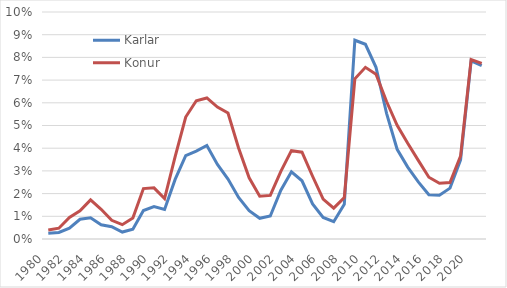
| Category | Karlar | Konur |
|---|---|---|
| 1980.0 | 0.257 | 0.394 |
| 1981.0 | 0.291 | 0.475 |
| 1982.0 | 0.478 | 0.952 |
| 1983.0 | 0.87 | 1.244 |
| 1984.0 | 0.933 | 1.723 |
| 1985.0 | 0.629 | 1.31 |
| 1986.0 | 0.542 | 0.822 |
| 1987.0 | 0.306 | 0.632 |
| 1988.0 | 0.432 | 0.924 |
| 1989.0 | 1.254 | 2.222 |
| 1990.0 | 1.432 | 2.253 |
| 1991.0 | 1.3 | 1.777 |
| 1992.0 | 2.626 | 3.632 |
| 1993.0 | 3.671 | 5.373 |
| 1994.0 | 3.868 | 6.092 |
| 1995.0 | 4.121 | 6.215 |
| 1996.0 | 3.287 | 5.81 |
| 1997.0 | 2.639 | 5.549 |
| 1998.0 | 1.833 | 4.012 |
| 1999.0 | 1.248 | 2.693 |
| 2000.0 | 0.912 | 1.885 |
| 2001.0 | 1.014 | 1.922 |
| 2002.0 | 2.147 | 2.977 |
| 2003.0 | 2.96 | 3.891 |
| 2004.0 | 2.564 | 3.825 |
| 2005.0 | 1.542 | 2.764 |
| 2006.0 | 0.948 | 1.756 |
| 2007.0 | 0.764 | 1.358 |
| 2008.0 | 1.525 | 1.823 |
| 2009.0 | 8.757 | 7.055 |
| 2010.0 | 8.577 | 7.562 |
| 2011.0 | 7.562 | 7.259 |
| 2012.0 | 5.535 | 6.055 |
| 2013.0 | 3.952 | 5.009 |
| 2014.0 | 3.166 | 4.215 |
| 2015.0 | 2.515 | 3.463 |
| 2016.0 | 1.948 | 2.723 |
| 2017.0 | 1.926 | 2.453 |
| 2018.0 | 2.241 | 2.486 |
| 2019.0 | 3.488 | 3.656 |
| 2020.0 | 7.851 | 7.906 |
| 2021.0 | 7.643 | 7.735 |